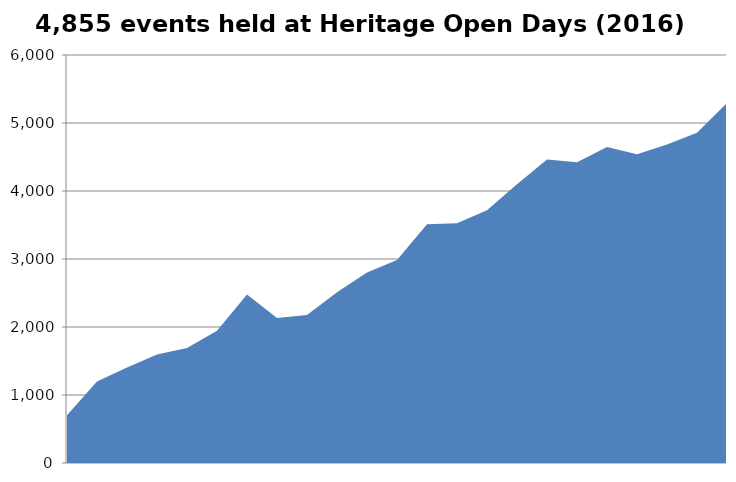
| Category | Number of HODs events  |
|---|---|
| 0 | 701 |
| 1 | 1200 |
| 2 | 1406 |
| 3 | 1596 |
| 4 | 1693 |
| 5 | 1946 |
| 6 | 2478 |
| 7 | 2133 |
| 8 | 2177 |
| 9 | 2512 |
| 10 | 2800 |
| 11 | 2985 |
| 12 | 3512 |
| 13 | 3526 |
| 14 | 3717 |
| 15 | 4100 |
| 16 | 4463 |
| 17 | 4421 |
| 18 | 4648 |
| 19 | 4540 |
| 20 | 4685 |
| 21 | 4855 |
| 22 | 5293 |